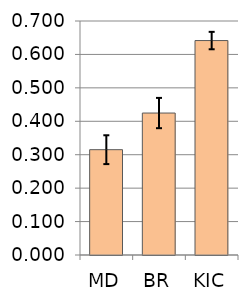
| Category | MD BR KIC |
|---|---|
| MD | 0.315 |
| BR | 0.425 |
| KIC | 0.641 |